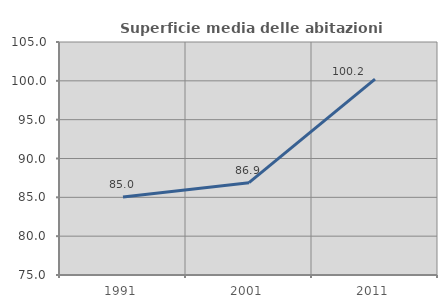
| Category | Superficie media delle abitazioni occupate |
|---|---|
| 1991.0 | 85.037 |
| 2001.0 | 86.883 |
| 2011.0 | 100.213 |